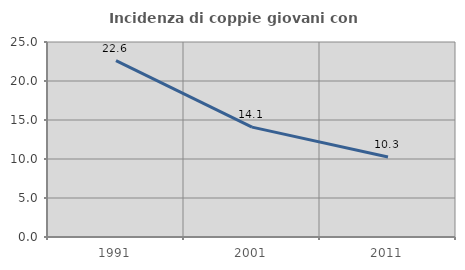
| Category | Incidenza di coppie giovani con figli |
|---|---|
| 1991.0 | 22.613 |
| 2001.0 | 14.083 |
| 2011.0 | 10.251 |